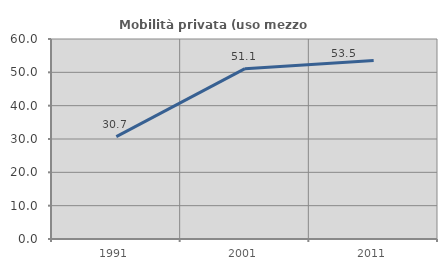
| Category | Mobilità privata (uso mezzo privato) |
|---|---|
| 1991.0 | 30.695 |
| 2001.0 | 51.091 |
| 2011.0 | 53.533 |